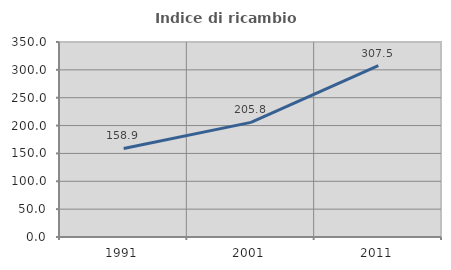
| Category | Indice di ricambio occupazionale  |
|---|---|
| 1991.0 | 158.904 |
| 2001.0 | 205.769 |
| 2011.0 | 307.5 |